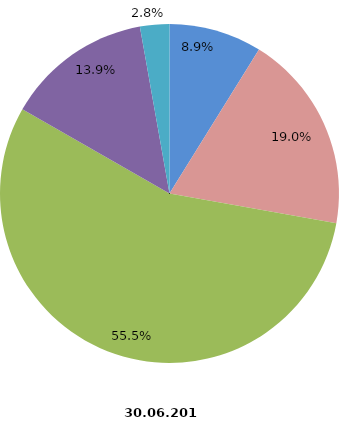
| Category | Beschäftigte 2016 |
|---|---|
| tätige Inhaber und Mitinhaber sowie unbezahlt mithelfende Familienangehörige | 2297 |
| kaufmännische und technische Arbeitnehmer | 4921 |
| Facharbeiter | 14388 |
| Fachwerker und Werker | 3615 |
| gewerblich Auszubildende, Umschüler, Praktikanten | 726 |